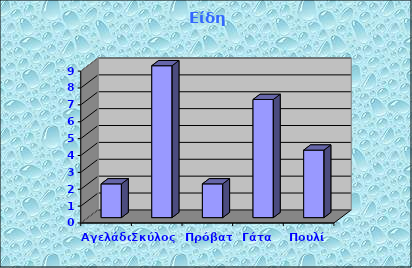
| Category | Είδη ζώων |
|---|---|
| Αγελάδα | 2 |
| Σκύλος  | 9 |
| Πρόβατο | 2 |
| Γάτα | 7 |
| Πουλί | 4 |